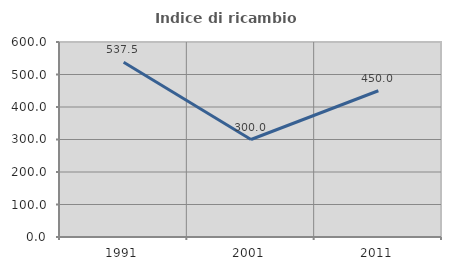
| Category | Indice di ricambio occupazionale  |
|---|---|
| 1991.0 | 537.5 |
| 2001.0 | 300 |
| 2011.0 | 450 |